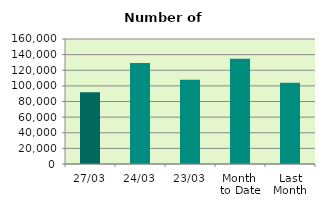
| Category | Series 0 |
|---|---|
| 27/03 | 91994 |
| 24/03 | 129270 |
| 23/03 | 107780 |
| Month 
to Date | 134720.947 |
| Last
Month | 103910.7 |